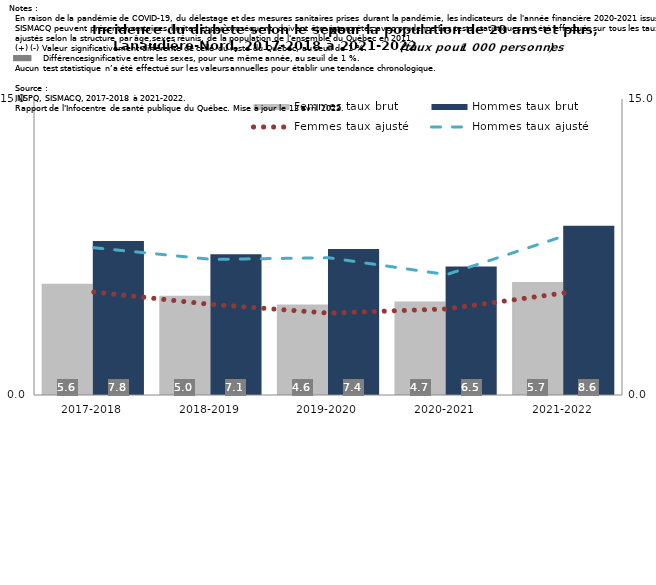
| Category | Femmes taux brut | Hommes taux brut |
|---|---|---|
| 2017-2018 | 5.644 | 7.805 |
| 2018-2019 | 5.028 | 7.137 |
| 2019-2020 | 4.588 | 7.404 |
| 2020-2021 | 4.735 | 6.517 |
| 2021-2022 | 5.725 | 8.578 |